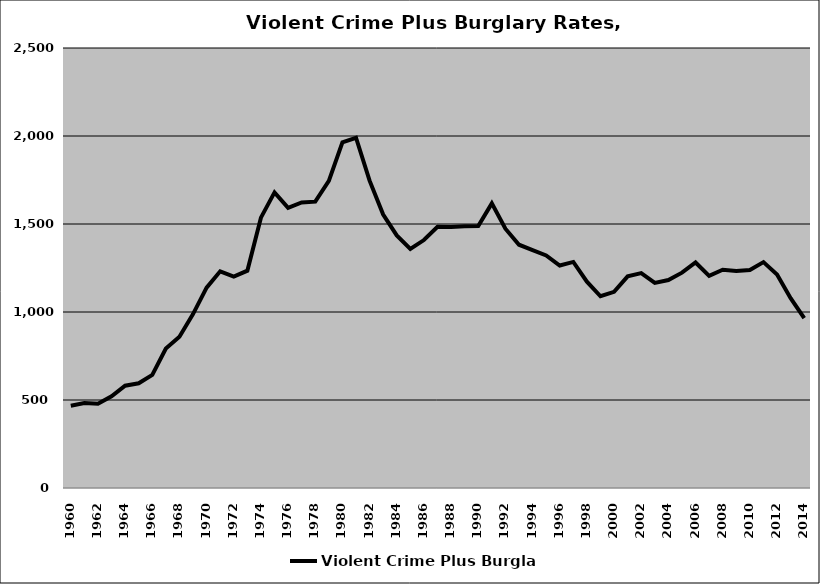
| Category | Violent Crime Plus Burglary |
|---|---|
| 1960.0 | 467.527 |
| 1961.0 | 482.614 |
| 1962.0 | 479.152 |
| 1963.0 | 520.83 |
| 1964.0 | 581.01 |
| 1965.0 | 595.286 |
| 1966.0 | 642.339 |
| 1967.0 | 792.542 |
| 1968.0 | 859.853 |
| 1969.0 | 988.24 |
| 1970.0 | 1138.113 |
| 1971.0 | 1231.017 |
| 1972.0 | 1200.705 |
| 1973.0 | 1234.685 |
| 1974.0 | 1535.95 |
| 1975.0 | 1679.45 |
| 1976.0 | 1591.871 |
| 1977.0 | 1622.671 |
| 1978.0 | 1627.128 |
| 1979.0 | 1744.665 |
| 1980.0 | 1964.556 |
| 1981.0 | 1990.163 |
| 1982.0 | 1746.289 |
| 1983.0 | 1553.49 |
| 1984.0 | 1435.24 |
| 1985.0 | 1358.153 |
| 1986.0 | 1408.78 |
| 1987.0 | 1483.828 |
| 1988.0 | 1483.389 |
| 1989.0 | 1486.807 |
| 1990.0 | 1488.682 |
| 1991.0 | 1616.994 |
| 1992.0 | 1473.239 |
| 1993.0 | 1382.283 |
| 1994.0 | 1352.054 |
| 1995.0 | 1321.299 |
| 1996.0 | 1264.047 |
| 1997.0 | 1284.445 |
| 1998.0 | 1172.567 |
| 1999.0 | 1089.48 |
| 2000.0 | 1114.855 |
| 2001.0 | 1202.244 |
| 2002.0 | 1220.928 |
| 2003.0 | 1165.166 |
| 2004.0 | 1181.688 |
| 2005.0 | 1223.51 |
| 2006.0 | 1281.372 |
| 2007.0 | 1205.642 |
| 2008.0 | 1240.086 |
| 2009.0 | 1232.941 |
| 2010.0 | 1238.564 |
| 2011.0 | 1283.415 |
| 2012.0 | 1213.006 |
| 2013.0 | 1078.568 |
| 2014.0 | 964.925 |